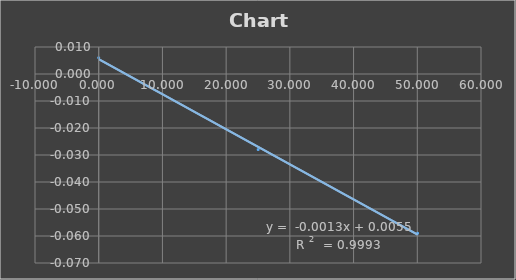
| Category | Series 0 |
|---|---|
| -0.006 | 0.006 |
| 25.022 | -0.028 |
| 50.05 | -0.059 |